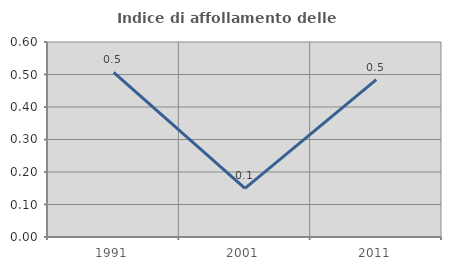
| Category | Indice di affollamento delle abitazioni  |
|---|---|
| 1991.0 | 0.506 |
| 2001.0 | 0.149 |
| 2011.0 | 0.484 |